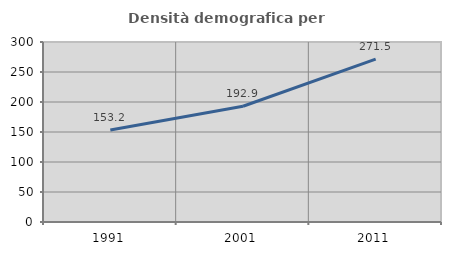
| Category | Densità demografica |
|---|---|
| 1991.0 | 153.197 |
| 2001.0 | 192.908 |
| 2011.0 | 271.475 |